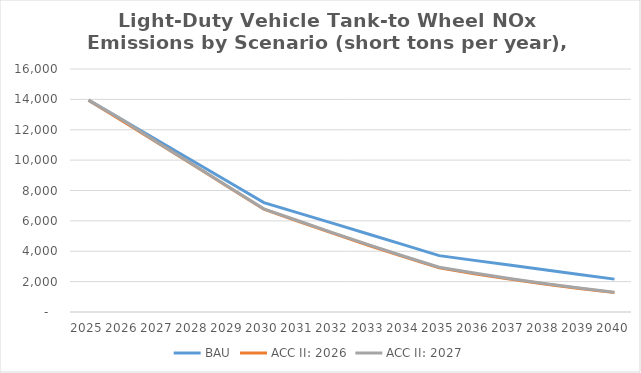
| Category | BAU | ACC II: 2026 | ACC II: 2027 |
|---|---|---|---|
| 2025.0 | 13948.212 | 13948.212 | 13948.212 |
| 2026.0 | 12599.921 | 12536.262 | 12599.921 |
| 2027.0 | 11256.53 | 11102.243 | 11113.423 |
| 2028.0 | 9910.779 | 9660.624 | 9678.216 |
| 2029.0 | 8561.356 | 8208.699 | 8232.737 |
| 2030.0 | 7205.189 | 6765.466 | 6794.353 |
| 2031.0 | 6511.364 | 5956.06 | 5990.982 |
| 2032.0 | 5815.51 | 5155.717 | 5195.224 |
| 2033.0 | 5118.887 | 4377.254 | 4419.251 |
| 2034.0 | 4421.929 | 3627.332 | 3669.588 |
| 2035.0 | 3710.91 | 2903.296 | 2943.346 |
| 2036.0 | 3399.954 | 2524.793 | 2564.976 |
| 2037.0 | 3089.281 | 2172.075 | 2210.797 |
| 2038.0 | 2779.274 | 1845.515 | 1881.512 |
| 2039.0 | 2471.287 | 1545.875 | 1577.803 |
| 2040.0 | 2164.982 | 1275.487 | 1302.283 |